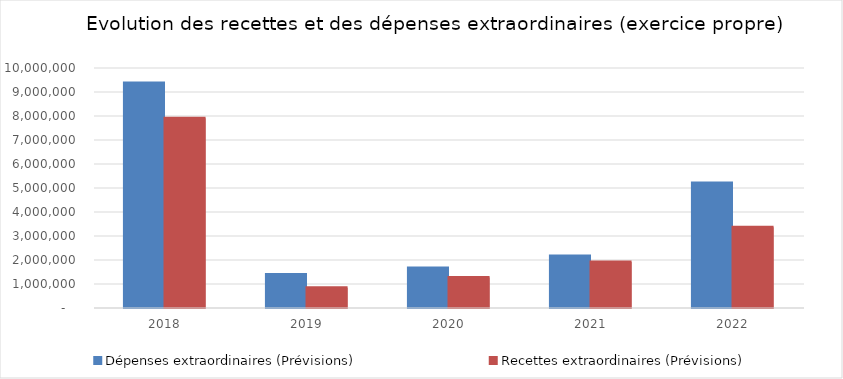
| Category | Dépenses extraordinaires (Prévisions) | Recettes extraordinaires (Prévisions) |
|---|---|---|
| 2018.0 | 9372220.2 | 7904082 |
| 2019.0 | 1397141.74 | 842210.88 |
| 2020.0 | 1670197.5 | 1273397.6 |
| 2021.0 | 2164547.35 | 1918528.67 |
| 2022.0 | 5210331.95 | 3360086.63 |